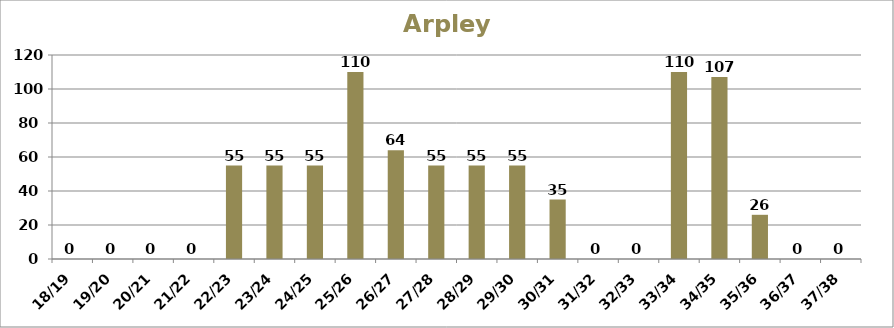
| Category | Arpley Road |
|---|---|
| 18/19 | 0 |
| 19/20 | 0 |
| 20/21 | 0 |
| 21/22 | 0 |
| 22/23 | 55 |
| 23/24 | 55 |
| 24/25 | 55 |
| 25/26 | 110 |
| 26/27 | 64 |
| 27/28 | 55 |
| 28/29 | 55 |
| 29/30 | 55 |
| 30/31 | 35 |
| 31/32 | 0 |
| 32/33 | 0 |
| 33/34 | 110 |
| 34/35 | 107 |
| 35/36 | 26 |
| 36/37 | 0 |
| 37/38 | 0 |